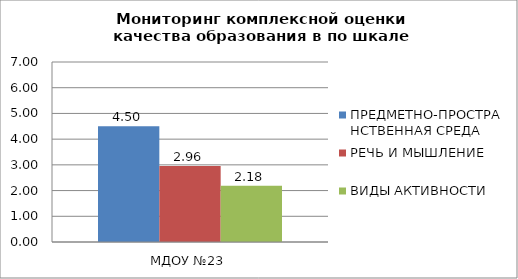
| Category | ПРЕДМЕТНО-ПРОСТРАНСТВЕННАЯ СРЕДА | РЕЧЬ И МЫШЛЕНИЕ | ВИДЫ АКТИВНОСТИ |
|---|---|---|---|
| 0 | 4.5 | 2.958 | 2.183 |